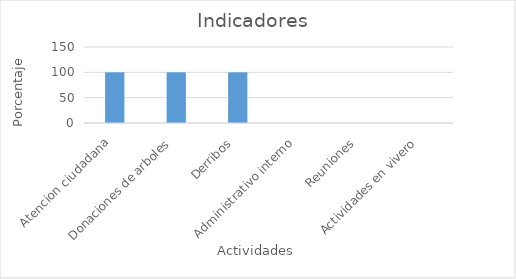
| Category | porcentaje  |
|---|---|
| Atencion ciudadana  | 100 |
| Donaciones de arboles  | 100 |
| Derribos  | 100 |
| Administrativo interno  | 0 |
| Reuniones  | 0 |
| Actividades en vivero  | 0 |